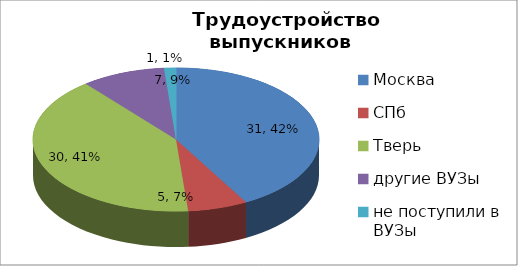
| Category | Series 0 |
|---|---|
| Москва | 31 |
| СПб | 5 |
| Тверь | 30 |
| другие ВУЗы | 7 |
| не поступили в ВУЗы | 1 |